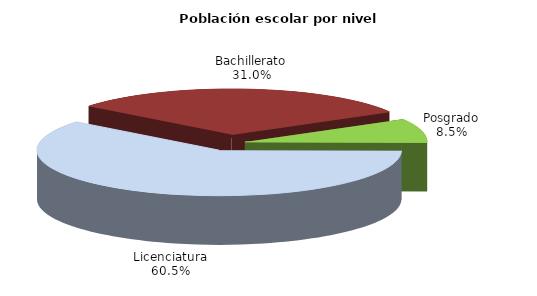
| Category | Series 0 |
|---|---|
| Posgrado | 30634 |
| Licenciatura | 217808 |
| Bachillerato | 111569 |